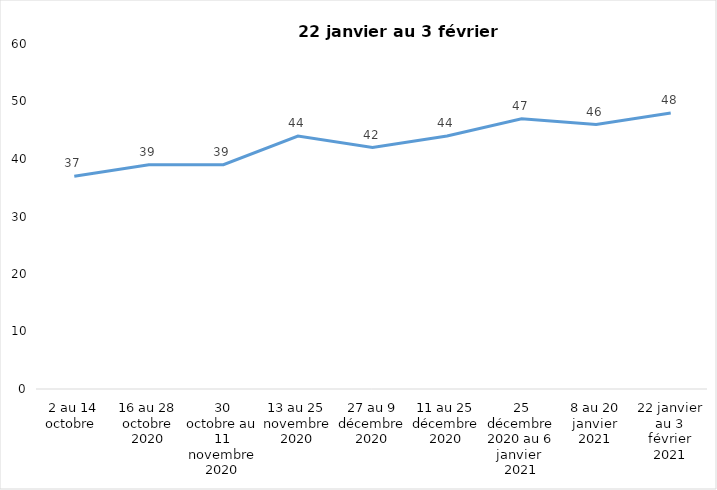
| Category | Toujours aux trois mesures |
|---|---|
| 2 au 14 octobre  | 37 |
| 16 au 28 octobre 2020 | 39 |
| 30 octobre au 11 novembre 2020 | 39 |
| 13 au 25 novembre 2020 | 44 |
| 27 au 9 décembre 2020 | 42 |
| 11 au 25 décembre 2020 | 44 |
| 25 décembre 2020 au 6 janvier  2021 | 47 |
| 8 au 20 janvier 2021 | 46 |
| 22 janvier au 3 février 2021 | 48 |